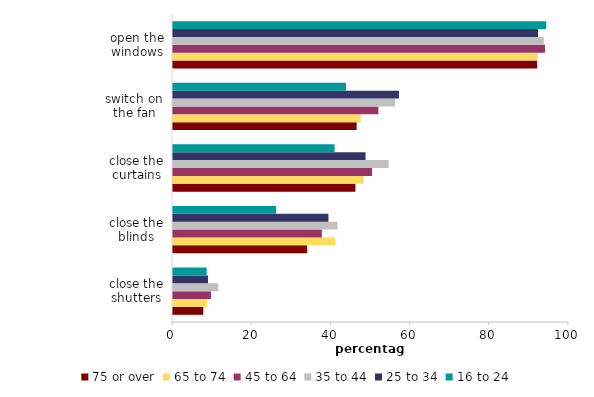
| Category | 75 or over | 65 to 74 | 45 to 64 | 35 to 44 | 25 to 34 | 16 to 24 |
|---|---|---|---|---|---|---|
| close the shutters | 7.651 | 8.552 | 9.575 | 11.423 | 8.837 | 8.503 |
| close the blinds | 33.882 | 40.976 | 37.576 | 41.561 | 39.254 | 26.04 |
| close the curtains | 46.069 | 48.091 | 50.267 | 54.455 | 48.629 | 40.805 |
| switch on the fan | 46.375 | 47.36 | 51.855 | 56.051 | 57.052 | 43.675 |
| open the windows | 91.954 | 92.124 | 93.948 | 93.656 | 92.17 | 94.257 |